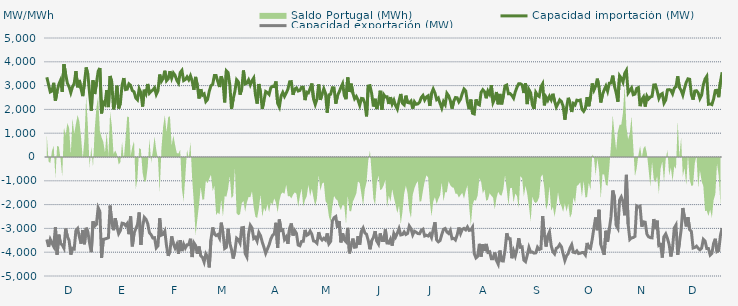
| Category | Capacidad importación (MW) | Capacidad exportación (MW) |
|---|---|---|
| 0 | 3348.75 | -3465 |
| 1900-01-01 | 3046.333 | -3774.375 |
| 1900-01-02 | 2732.708 | -3460.042 |
| 1900-01-03 | 2770.75 | -3616.875 |
| 1900-01-04 | 3116.25 | -3757.75 |
| 1900-01-05 | 2370.5 | -2949.375 |
| 1900-01-06 | 2758.625 | -4102.5 |
| 1900-01-07 | 3054.167 | -3262.5 |
| 1900-01-08 | 3221.875 | -3637.5 |
| 1900-01-09 | 2734.792 | -3695.625 |
| 1900-01-10 | 3901.875 | -3830.625 |
| 1900-01-11 | 3478.125 | -3007.5 |
| 1900-01-12 | 3100.208 | -3343.125 |
| 1900-01-13 | 2951.458 | -3500.625 |
| 1900-01-14 | 2703.125 | -4100.625 |
| 1900-01-15 | 2949.667 | -3832.5 |
| 1900-01-16 | 3092.292 | -3864.375 |
| 1900-01-17 | 3609.375 | -3088.125 |
| 1900-01-18 | 2928.75 | -3003.75 |
| 1900-01-19 | 3238.333 | -3346.875 |
| 1900-01-20 | 2865.417 | -3639.375 |
| 1900-01-21 | 2557.917 | -3067.5 |
| 1900-01-22 | 3131.667 | -3665.625 |
| 1900-01-23 | 3761.25 | -2973.625 |
| 1900-01-24 | 3468.542 | -3153.75 |
| 1900-01-25 | 2673.75 | -3622.5 |
| 1900-01-26 | 1945.625 | -3999.375 |
| 1900-01-27 | 3222.083 | -2703.875 |
| 1900-01-28 | 2645.458 | -2900.625 |
| 1900-01-29 | 3097.5 | -2827.5 |
| 1900-01-30 | 3595.208 | -2128.75 |
| 1900-01-31 | 3741.458 | -2283.75 |
| 1900-02-01 | 1833.125 | -4242.5 |
| 1900-02-02 | 2294.25 | -3457.125 |
| 1900-02-03 | 2210.833 | -3444.375 |
| 1900-02-04 | 2808.75 | -3420 |
| 1900-02-05 | 2098.083 | -3391.875 |
| 1900-02-06 | 3404.792 | -2041.875 |
| 1900-02-07 | 3136.875 | -2790.292 |
| 1900-02-08 | 2001.25 | -3075.75 |
| 1900-02-09 | 2334.583 | -2570.625 |
| 1900-02-10 | 2998.542 | -2932.5 |
| 1900-02-11 | 2041.583 | -3219.375 |
| 1900-02-12 | 2261.875 | -3091.875 |
| 1900-02-13 | 3017.292 | -2780.625 |
| 1900-02-14 | 3316.667 | -2796 |
| 1900-02-15 | 2831.875 | -2880.375 |
| 1900-02-16 | 2848.875 | -2791.375 |
| 1900-02-17 | 3072.083 | -3242.5 |
| 1900-02-18 | 3008.75 | -2494.125 |
| 1900-02-19 | 2789.75 | -3753.75 |
| 1900-02-20 | 2740.75 | -3208.125 |
| 1900-02-21 | 2484.167 | -3015 |
| 1900-02-22 | 2405.083 | -2845.208 |
| 1900-02-23 | 2862.542 | -2330.625 |
| 1900-02-24 | 2704.875 | -3693.75 |
| 1900-02-25 | 2121.458 | -2932.25 |
| 1900-02-26 | 2826.875 | -2536.458 |
| 1900-02-27 | 2666.25 | -2617.875 |
| 1900-02-28 | 3068.375 | -2797.625 |
| 1900-02-28 | 2681.458 | -3181.875 |
| 1900-03-01 | 2762.167 | -3268.125 |
| 1900-03-02 | 2816.458 | -3403.125 |
| 1900-03-03 | 2908.75 | -3388.125 |
| 1900-03-04 | 2628.458 | -3817.5 |
| 1900-03-05 | 2784.5 | -3729.375 |
| 1900-03-06 | 3466.875 | -2575.375 |
| 1900-03-07 | 3180 | -3284.375 |
| 1900-03-08 | 3301.25 | -3251.25 |
| 1900-03-09 | 3624.375 | -3114.375 |
| 1900-03-10 | 3203.333 | -3733.125 |
| 1900-03-11 | 3288.125 | -4155 |
| 1900-03-12 | 3606.25 | -3943.125 |
| 1900-03-13 | 3313.75 | -3335.625 |
| 1900-03-14 | 3531.417 | -3646.875 |
| 1900-03-15 | 3433.125 | -3826.875 |
| 1900-03-16 | 3223.542 | -3673.333 |
| 1900-03-17 | 3103.75 | -4066.875 |
| 1900-03-18 | 3546.25 | -3496.875 |
| 1900-03-19 | 3638.5 | -3952.5 |
| 1900-03-20 | 3210 | -3661.875 |
| 1900-03-21 | 3255.417 | -3826.875 |
| 1900-03-22 | 3367.5 | -3690 |
| 1900-03-23 | 3244.5 | -3684.375 |
| 1900-03-24 | 3411.458 | -3435 |
| 1900-03-25 | 3192.708 | -4203.75 |
| 1900-03-26 | 2825 | -3605.625 |
| 1900-03-27 | 3365.667 | -3718.625 |
| 1900-03-28 | 3014.375 | -4063.125 |
| 1900-03-29 | 2458.292 | -3762 |
| 1900-03-30 | 2845.5 | -4151.25 |
| 1900-03-31 | 2597.292 | -4215 |
| 1900-04-01 | 2650.375 | -4415.625 |
| 1900-04-02 | 2331.042 | -4066.875 |
| 1900-04-03 | 2415.625 | -4185 |
| 1900-04-04 | 2763.875 | -4638.75 |
| 1900-04-05 | 2996.042 | -3465 |
| 1900-04-06 | 3054.375 | -2960.625 |
| 1900-04-07 | 3421.875 | -3238.875 |
| 1900-04-08 | 3422.25 | -3301.458 |
| 1900-04-09 | 3168.75 | -3257.708 |
| 1900-04-10 | 2940.75 | -3407.5 |
| 1900-04-11 | 3391.875 | -2758.75 |
| 1900-04-12 | 3159.375 | -3175.208 |
| 1900-04-13 | 2294.792 | -3843.75 |
| 1900-04-14 | 3620.625 | -3793.125 |
| 1900-04-15 | 3550.208 | -3016.875 |
| 1900-04-16 | 3036.458 | -3616.875 |
| 1900-04-17 | 2023.333 | -3886.25 |
| 1900-04-18 | 2440.208 | -4263.75 |
| 1900-04-19 | 2764.167 | -3943.125 |
| 1900-04-20 | 3245.625 | -3410.667 |
| 1900-04-21 | 3161.25 | -3470.625 |
| 1900-04-22 | 2621.458 | -3614.625 |
| 1900-04-23 | 2861.25 | -2975.958 |
| 1900-04-24 | 3635.217 | -2962.391 |
| 1900-04-25 | 3071.083 | -4052.75 |
| 1900-04-26 | 3103.625 | -4196.25 |
| 1900-04-27 | 3238.125 | -3235.75 |
| 1900-04-28 | 3031.875 | -2868.708 |
| 1900-04-29 | 3202.5 | -2981.292 |
| 1900-04-30 | 3320.625 | -3422.292 |
| 1900-05-01 | 2615.625 | -3370.417 |
| 1900-05-02 | 2244.375 | -3535.625 |
| 1900-05-03 | 3067.5 | -3176.25 |
| 1900-05-04 | 2692.458 | -3306.875 |
| 1900-05-05 | 2025 | -3576.042 |
| 1900-05-06 | 2373.833 | -3795 |
| 1900-05-07 | 2750.458 | -4045 |
| 1900-05-08 | 2704.167 | -3868.417 |
| 1900-05-09 | 2628.75 | -3691.667 |
| 1900-05-10 | 2910 | -3448.125 |
| 1900-05-11 | 2971.875 | -3293.375 |
| 1900-05-12 | 2958.5 | -3229.167 |
| 1900-05-13 | 3174.375 | -2764.583 |
| 1900-05-14 | 2253.75 | -3813.75 |
| 1900-05-15 | 2100 | -2628.667 |
| 1900-05-16 | 2557.5 | -3088.333 |
| 1900-05-17 | 2713.125 | -3062.25 |
| 1900-05-18 | 2546.875 | -3463.625 |
| 1900-05-19 | 2686.458 | -3359.458 |
| 1900-05-20 | 2850 | -3646.042 |
| 1900-05-21 | 3159.375 | -2992.292 |
| 1900-05-22 | 3166.875 | -2793.125 |
| 1900-05-23 | 2613.75 | -3298.833 |
| 1900-05-24 | 2857.5 | -3089.625 |
| 1900-05-25 | 2903.875 | -3210.125 |
| 1900-05-26 | 2772 | -3696.792 |
| 1900-05-27 | 2797.5 | -3731.25 |
| 1900-05-28 | 2930.625 | -3545.625 |
| 1900-05-29 | 2932.5 | -3541.875 |
| 1900-05-30 | 2390.625 | -3064.167 |
| 1900-05-31 | 2726.25 | -3293.333 |
| 1900-06-01 | 2694.375 | -3252.708 |
| 1900-06-02 | 2878.125 | -3111.875 |
| 1900-06-03 | 3088.125 | -3247.5 |
| 1900-06-04 | 2435.625 | -3528.958 |
| 1900-06-05 | 2206.875 | -3547.708 |
| 1900-06-06 | 2435.625 | -3618.75 |
| 1900-06-07 | 3046.875 | -3157.917 |
| 1900-06-08 | 2400 | -3406.875 |
| 1900-06-09 | 2640 | -3488.125 |
| 1900-06-10 | 2866.875 | -3413.542 |
| 1900-06-11 | 2675.625 | -3486.458 |
| 1900-06-12 | 1861.25 | -3211.667 |
| 1900-06-13 | 2611.875 | -3644.375 |
| 1900-06-14 | 2638.125 | -3547.083 |
| 1900-06-15 | 2906.25 | -2688.333 |
| 1900-06-16 | 2904.375 | -2549.583 |
| 1900-06-17 | 2240.625 | -2502.083 |
| 1900-06-18 | 2576.25 | -2981.667 |
| 1900-06-19 | 2732.25 | -2689.375 |
| 1900-06-20 | 2919.375 | -3586.875 |
| 1900-06-21 | 3078.75 | -3206.25 |
| 1900-06-22 | 2587.5 | -3481.875 |
| 1900-06-23 | 2430 | -3560.625 |
| 1900-06-24 | 3341.25 | -2977.542 |
| 1900-06-25 | 2733.75 | -4046.25 |
| 1900-06-26 | 3080.625 | -3725.417 |
| 1900-06-27 | 2681.25 | -3429.375 |
| 1900-06-28 | 2448.75 | -3793.125 |
| 1900-06-29 | 2544.125 | -3778.125 |
| 1900-06-30 | 2394.958 | -3328.125 |
| 1900-07-01 | 2175 | -3678.75 |
| 1900-07-02 | 2461.167 | -3117.375 |
| 1900-07-03 | 2448.75 | -2981.542 |
| 1900-07-04 | 2255.042 | -3185.833 |
| 1900-07-05 | 1708.042 | -3250.208 |
| 1900-07-06 | 2981.25 | -3508.125 |
| 1900-07-07 | 2998.125 | -3877.5 |
| 1900-07-08 | 2664.375 | -3519.375 |
| 1900-07-09 | 2124.375 | -3382.5 |
| 1900-07-10 | 2446.875 | -3115.792 |
| 1900-07-11 | 2015.417 | -3534.375 |
| 1900-07-12 | 2289.375 | -3658.125 |
| 1900-07-13 | 2784.375 | -3211.083 |
| 1900-07-14 | 1993.125 | -3504.792 |
| 1900-07-15 | 2624.875 | -3506.458 |
| 1900-07-16 | 2523.75 | -3042.583 |
| 1900-07-17 | 2531.25 | -3613.125 |
| 1900-07-18 | 2229.583 | -3620.625 |
| 1900-07-19 | 2515.875 | -3455.625 |
| 1900-07-20 | 2227.5 | -3723.75 |
| 1900-07-21 | 2388.375 | -3217.458 |
| 1900-07-22 | 2157.875 | -3361.542 |
| 1900-07-23 | 2014.583 | -3202.708 |
| 1900-07-24 | 2357.917 | -3006.583 |
| 1900-07-25 | 2647.75 | -3275.625 |
| 1900-07-26 | 2259.375 | -3258.75 |
| 1900-07-27 | 2191.875 | -3148.125 |
| 1900-07-28 | 2578.125 | -3256.875 |
| 1900-07-29 | 2289.375 | -3211.875 |
| 1900-07-30 | 2272.917 | -2898.25 |
| 1900-07-31 | 2349.75 | -3012.25 |
| 1900-08-01 | 2034.167 | -3270 |
| 1900-08-02 | 2319.375 | -3116.25 |
| 1900-08-03 | 2214.375 | -3159.375 |
| 1900-08-04 | 2229.167 | -3217.5 |
| 1900-08-05 | 2296.875 | -3223.125 |
| 1900-08-06 | 2497.5 | -3080.208 |
| 1900-08-07 | 2585.5 | -3034.292 |
| 1900-08-08 | 2394.375 | -3318.75 |
| 1900-08-09 | 2520 | -3286.875 |
| 1900-08-10 | 2570.625 | -3320.625 |
| 1900-08-11 | 2145 | -3229.583 |
| 1900-08-12 | 2673.75 | -3384.375 |
| 1900-08-13 | 2855.625 | -3040.333 |
| 1900-08-14 | 2689.875 | -2741.708 |
| 1900-08-15 | 2413.125 | -3485.625 |
| 1900-08-16 | 2476.875 | -3564.375 |
| 1900-08-17 | 2258.75 | -3510 |
| 1900-08-18 | 2056.875 | -3258.75 |
| 1900-08-19 | 2326.875 | -3036.667 |
| 1900-08-20 | 2203.125 | -3003.75 |
| 1900-08-21 | 2675.333 | -3153.417 |
| 1900-08-22 | 2572.5 | -3211.875 |
| 1900-08-23 | 2368.125 | -3082.917 |
| 1900-08-24 | 2032.5 | -3433.125 |
| 1900-08-25 | 2340 | -3418.125 |
| 1900-08-26 | 2499.375 | -3485.625 |
| 1900-08-27 | 2488.125 | -3277.5 |
| 1900-08-28 | 2317.5 | -2963.167 |
| 1900-08-29 | 2431.875 | -3217.5 |
| 1900-08-30 | 2668.125 | -3039.375 |
| 1900-08-31 | 2855.625 | -2998.125 |
| 1900-09-01 | 2778.75 | -3061.667 |
| 1900-09-02 | 2311.875 | -2941.042 |
| 1900-09-03 | 2010 | -3084.375 |
| 1900-09-04 | 2411.25 | -3065.625 |
| 1900-09-05 | 1837.917 | -2945.625 |
| 1900-09-06 | 1809.167 | -4055.625 |
| 1900-09-07 | 2419.792 | -4241.25 |
| 1900-09-08 | 2227.5 | -4173.75 |
| 1900-09-09 | 2191.875 | -3648.75 |
| 1900-09-10 | 2715 | -4183.125 |
| 1900-09-11 | 2826.625 | -3667.292 |
| 1900-09-12 | 2745 | -3950.625 |
| 1900-09-13 | 2467.5 | -3652.625 |
| 1900-09-14 | 2771.25 | -4006.875 |
| 1900-09-15 | 2640 | -3980.625 |
| 1900-09-16 | 3016.875 | -4271.25 |
| 1900-09-17 | 2292.292 | -4271.25 |
| 1900-09-18 | 2448.75 | -4010.625 |
| 1900-09-19 | 2730 | -4357.5 |
| 1900-09-20 | 2214.75 | -4501.875 |
| 1900-09-21 | 2650.208 | -3931.667 |
| 1900-09-22 | 2212.5 | -4361.25 |
| 1900-09-23 | 2565 | -4370.625 |
| 1900-09-24 | 2988.75 | -3920.625 |
| 1900-09-25 | 3024.375 | -3204.083 |
| 1900-09-26 | 2656.875 | -3437.708 |
| 1900-09-27 | 2664.375 | -3437.5 |
| 1900-09-28 | 2587.5 | -4254.375 |
| 1900-09-29 | 2473.125 | -3939.583 |
| 1900-09-30 | 2737.5 | -4156.875 |
| 1900-10-01 | 2932.5 | -3862.5 |
| 1900-10-02 | 3080.625 | -3412.708 |
| 1900-10-03 | 3078.125 | -3793.125 |
| 1900-10-04 | 3031.25 | -3776.25 |
| 1900-10-05 | 2689.875 | -4331.25 |
| 1900-10-06 | 3104.042 | -4396.875 |
| 1900-10-07 | 2223.25 | -4126.875 |
| 1900-10-08 | 2830.208 | -3799.583 |
| 1900-10-09 | 2694.375 | -3999.792 |
| 1900-10-10 | 2193.542 | -3994.167 |
| 1900-10-11 | 2019.375 | -4039.792 |
| 1900-10-12 | 2710.792 | -4026.667 |
| 1900-10-13 | 2589.292 | -3790.625 |
| 1900-10-14 | 2542.5 | -3888.75 |
| 1900-10-15 | 2943.75 | -3856.875 |
| 1900-10-16 | 3076.875 | -2486 |
| 1900-10-17 | 2169.583 | -3271.875 |
| 1900-10-18 | 2510.875 | -3762.292 |
| 1900-10-19 | 2379.375 | -3315.625 |
| 1900-10-20 | 2548.125 | -3149.875 |
| 1900-10-21 | 2405.625 | -3725.625 |
| 1900-10-22 | 2655.792 | -3978.75 |
| 1900-10-23 | 2338.917 | -4070.625 |
| 1900-10-24 | 2100.75 | -3836.25 |
| 1900-10-25 | 2239.583 | -3791.25 |
| 1900-10-26 | 2398.417 | -3671.25 |
| 1900-10-27 | 2333.375 | -3772.5 |
| 1900-10-28 | 2128.125 | -4065 |
| 1900-10-29 | 1568.375 | -4348.125 |
| 1900-10-30 | 2080.083 | -4146.125 |
| 1900-10-31 | 2486.208 | -4052.083 |
| 1900-11-01 | 2275.5 | -3824.583 |
| 1900-11-02 | 1891.708 | -3681.25 |
| 1900-11-03 | 2248.292 | -4001.25 |
| 1900-11-04 | 2190.75 | -4023.75 |
| 1900-11-05 | 2386.583 | -3945 |
| 1900-11-06 | 2366.708 | -4057.5 |
| 1900-11-07 | 2393.375 | -4042.25 |
| 1900-11-08 | 2007.375 | -4017.708 |
| 1900-11-09 | 1918.833 | -4016.25 |
| 1900-11-10 | 2042.417 | -4115.625 |
| 1900-11-11 | 2516.25 | -3611.25 |
| 1900-11-12 | 2132.708 | -3815.625 |
| 1900-11-13 | 2530.208 | -3849.375 |
| 1900-11-14 | 3090 | -3459.375 |
| 1900-11-15 | 2808.75 | -2974.875 |
| 1900-11-16 | 2978.125 | -2539.125 |
| 1900-11-17 | 3292.5 | -3075.208 |
| 1900-11-18 | 2935 | -2217.083 |
| 1900-11-19 | 2289.583 | -3673.125 |
| 1900-11-20 | 2619.375 | -3890.625 |
| 1900-11-21 | 2814.792 | -4110 |
| 1900-11-22 | 2979.375 | -3099.375 |
| 1900-11-23 | 2767.5 | -3556.875 |
| 1900-11-24 | 3099.375 | -3031.875 |
| 1900-11-25 | 3111.25 | -2508.75 |
| 1900-11-26 | 3418.125 | -1406.875 |
| 1900-11-27 | 2979.6 | -1681.6 |
| 1900-11-28 | 2705.333 | -2868.75 |
| 1900-11-29 | 2324.458 | -2999 |
| 1900-11-30 | 3414.375 | -1815.417 |
| 1900-12-01 | 3313.125 | -1677.917 |
| 1900-12-02 | 3144.583 | -1882.667 |
| 1900-12-03 | 3511.875 | -2448.75 |
| 1900-12-04 | 3639.375 | -750.708 |
| 1900-12-05 | 2688.958 | -2820 |
| 1900-12-06 | 2797.542 | -3465 |
| 1900-12-07 | 2902.5 | -3399.375 |
| 1900-12-08 | 2618.042 | -3382.5 |
| 1900-12-09 | 2643.417 | -3336.125 |
| 1900-12-10 | 2878.125 | -2058.75 |
| 1900-12-11 | 2915 | -2101.875 |
| 1900-12-12 | 2137.708 | -2068.125 |
| 1900-12-13 | 2411.042 | -2928.75 |
| 1900-12-14 | 2524.375 | -2722.5 |
| 1900-12-15 | 2118.542 | -2739.375 |
| 1900-12-16 | 2559.458 | -3244.292 |
| 1900-12-17 | 2440.833 | -3354.75 |
| 1900-12-18 | 2521.167 | -3387.25 |
| 1900-12-19 | 2546.333 | -3396.375 |
| 1900-12-20 | 3028.125 | -2606.25 |
| 1900-12-21 | 3031.875 | -3030 |
| 1900-12-22 | 2773.917 | -2675.625 |
| 1900-12-23 | 2465.417 | -3720 |
| 1900-12-24 | 2620.708 | -3684.375 |
| 1900-12-25 | 2665.625 | -4224.375 |
| 1900-12-26 | 2266.875 | -3343.125 |
| 1900-12-27 | 2395.625 | -3230.625 |
| 1900-12-28 | 2820.417 | -3421.875 |
| 1900-12-29 | 2831.667 | -3678.75 |
| 1900-12-30 | 2807.708 | -4181.25 |
| 1900-12-31 | 2656.917 | -3808.125 |
| 1901-01-01 | 2889.375 | -2983.125 |
| 1901-01-02 | 2955.417 | -2856.75 |
| 1901-01-03 | 3390.125 | -4111.875 |
| 1901-01-04 | 2918.167 | -3607.5 |
| 1901-01-05 | 2805 | -3067.5 |
| 1901-01-06 | 2603.792 | -2143.125 |
| 1901-01-07 | 2889.792 | -2566.125 |
| 1901-01-08 | 3138.75 | -2918.333 |
| 1901-01-09 | 3284.583 | -2531.167 |
| 1901-01-10 | 3266.875 | -3054.375 |
| 1901-01-11 | 2630.625 | -3127.125 |
| 1901-01-12 | 2410.625 | -3825 |
| 1901-01-13 | 2771.375 | -3800.625 |
| 1901-01-14 | 2785.375 | -3746.25 |
| 1901-01-15 | 2693.917 | -3833.125 |
| 1901-01-16 | 2453.958 | -3898.125 |
| 1901-01-17 | 2603.042 | -3832.458 |
| 1901-01-18 | 3040.208 | -3455.125 |
| 1901-01-19 | 3274.75 | -3527.125 |
| 1901-01-20 | 3387 | -3843.75 |
| 1901-01-21 | 2216.667 | -3847.5 |
| 1901-01-22 | 2229.75 | -4117.5 |
| 1901-01-23 | 2201.625 | -4044.375 |
| 1901-01-24 | 2438.958 | -3630 |
| 1901-01-25 | 2792.375 | -3435 |
| 1901-01-26 | 2803.958 | -3975 |
| 1901-01-27 | 2513.542 | -3933.75 |
| 1901-01-28 | 3165 | -3294.375 |
| 1901-01-29 | 3560.625 | -2987.875 |